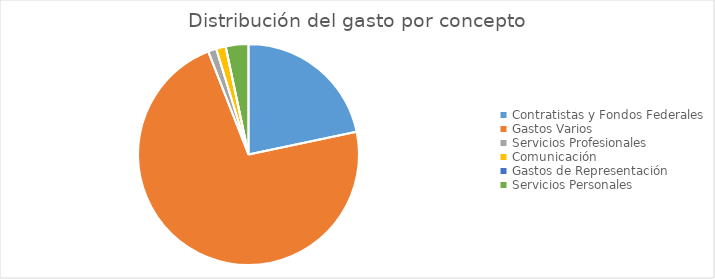
| Category | Series 0 |
|---|---|
| Contratistas y Fondos Federales | 89355163.55 |
| Gastos Varios | 298200990.26 |
| Servicios Profesionales | 4997665.37 |
| Comunicación | 5756457.59 |
| Gastos de Representación | 3343.05 |
| Servicios Personales | 13691079.13 |